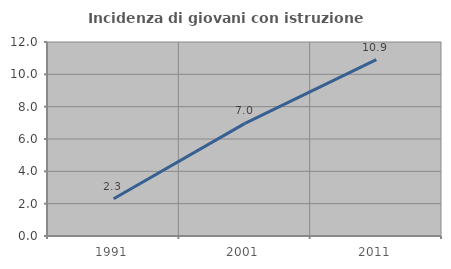
| Category | Incidenza di giovani con istruzione universitaria |
|---|---|
| 1991.0 | 2.305 |
| 2001.0 | 6.966 |
| 2011.0 | 10.905 |